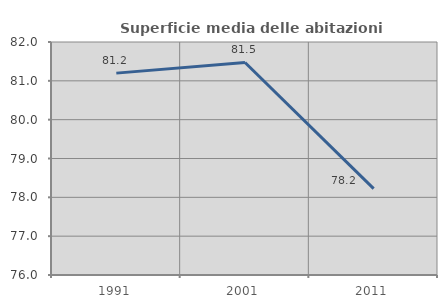
| Category | Superficie media delle abitazioni occupate |
|---|---|
| 1991.0 | 81.199 |
| 2001.0 | 81.472 |
| 2011.0 | 78.226 |